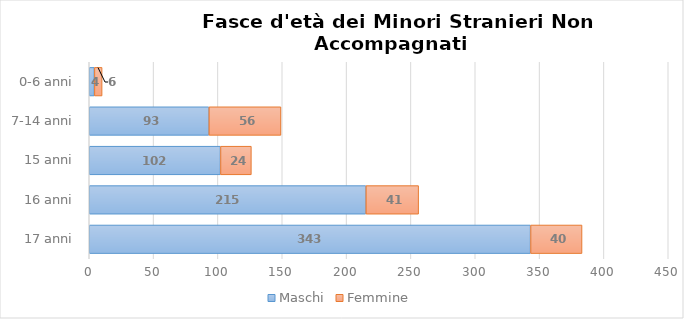
| Category | Maschi | Femmine |
|---|---|---|
| 17 anni | 343 | 40 |
| 16 anni | 215 | 41 |
| 15 anni | 102 | 24 |
| 7-14 anni | 93 | 56 |
| 0-6 anni | 4 | 6 |